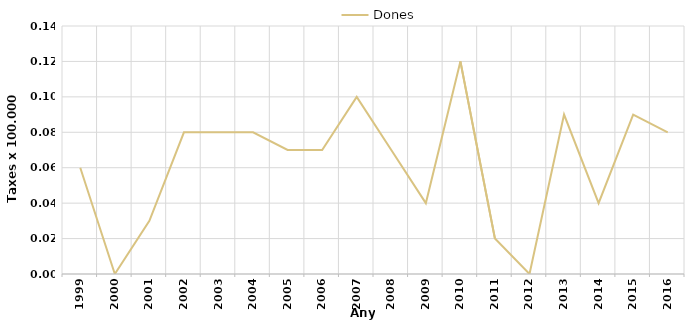
| Category | Dones |
|---|---|
| 1999.0 | 0.06 |
| 2000.0 | 0 |
| 2001.0 | 0.03 |
| 2002.0 | 0.08 |
| 2003.0 | 0.08 |
| 2004.0 | 0.08 |
| 2005.0 | 0.07 |
| 2006.0 | 0.07 |
| 2007.0 | 0.1 |
| 2008.0 | 0.07 |
| 2009.0 | 0.04 |
| 2010.0 | 0.12 |
| 2011.0 | 0.02 |
| 2012.0 | 0 |
| 2013.0 | 0.09 |
| 2014.0 | 0.04 |
| 2015.0 | 0.09 |
| 2016.0 | 0.08 |